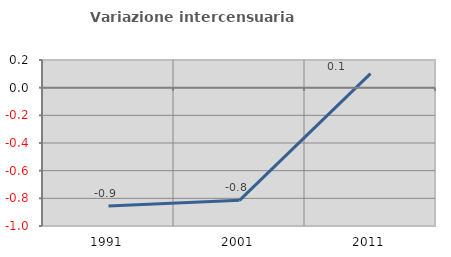
| Category | Variazione intercensuaria annua |
|---|---|
| 1991.0 | -0.855 |
| 2001.0 | -0.814 |
| 2011.0 | 0.101 |